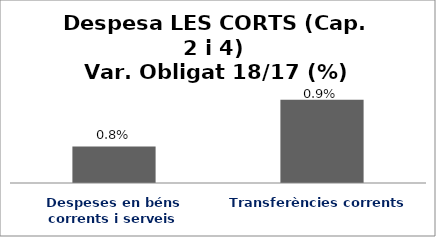
| Category | Series 0 |
|---|---|
| Despeses en béns corrents i serveis | 0.008 |
| Transferències corrents | 0.009 |